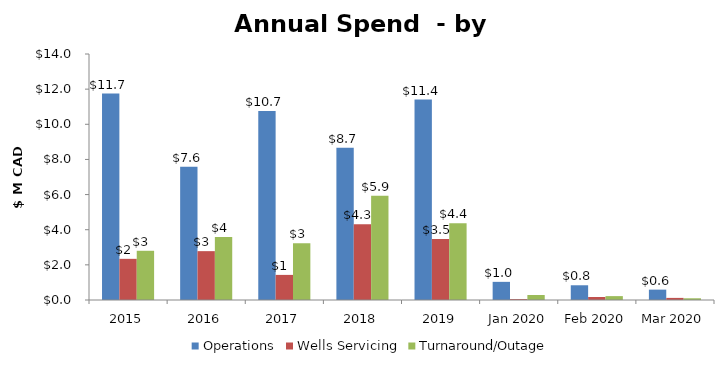
| Category | Operations | Wells Servicing | Turnaround/Outage |
|---|---|---|---|
| 2015 | 11747566 | 2342418 | 2801087 |
| 2016 | 7578731 | 2780334 | 3586352 |
| 2017 | 10749239.81 | 1428636.48 | 3234566.46 |
| 2018 | 8663752 | 4307384 | 5938895 |
| 2019 | 11409371 | 3474429 | 4367340 |
| Jan 2020 | 1032653.66 | 51128.66 | 283234.65 |
| Feb 2020 | 838128.86 | 170488.01 | 220750.93 |
| Mar 2020 | 589731.92 | 119792.88 | 97830.31 |